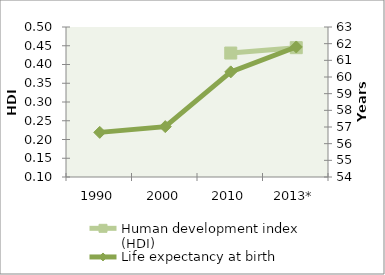
| Category | Human development index (HDI) |
|---|---|
| 1990 | 0 |
| 2000 | 0 |
| 2010 | 0.431 |
| 2013* | 0.445 |